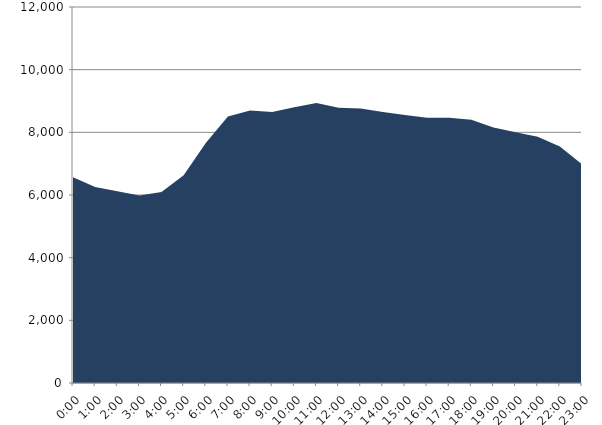
| Category | Series 0 | Series 1 |
|---|---|---|
| 2017-05-17 |  | 6562.81 |
| 2017-05-17 01:00:00 |  | 6255.04 |
| 2017-05-17 02:00:00 |  | 6119.13 |
| 2017-05-17 03:00:00 |  | 5982.6 |
| 2017-05-17 04:00:00 |  | 6092.03 |
| 2017-05-17 05:00:00 |  | 6626.55 |
| 2017-05-17 06:00:00 |  | 7660.22 |
| 2017-05-17 07:00:00 |  | 8509.27 |
| 2017-05-17 08:00:00 |  | 8695.72 |
| 2017-05-17 09:00:00 |  | 8647.8 |
| 2017-05-17 10:00:00 |  | 8797.36 |
| 2017-05-17 11:00:00 |  | 8939.3 |
| 2017-05-17 12:00:00 |  | 8788.14 |
| 2017-05-17 13:00:00 |  | 8763.57 |
| 2017-05-17 14:00:00 |  | 8650.95 |
| 2017-05-17 15:00:00 |  | 8554.83 |
| 2017-05-17 16:00:00 |  | 8463.72 |
| 2017-05-17 17:00:00 |  | 8462.61 |
| 2017-05-17 18:00:00 |  | 8404.36 |
| 2017-05-17 19:00:00 |  | 8157.81 |
| 2017-05-17 20:00:00 |  | 8002.64 |
| 2017-05-17 21:00:00 |  | 7859.22 |
| 2017-05-17 22:00:00 |  | 7547.46 |
| 2017-05-17 23:00:00 |  | 6979.28 |